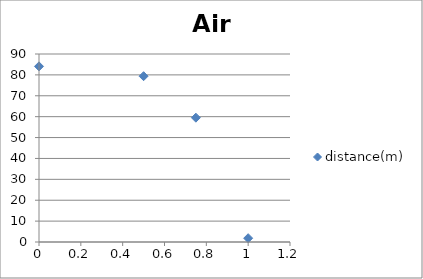
| Category | distance(m) |
|---|---|
| 0.0 | 84.086 |
| 0.5 | 79.383 |
| 0.75 | 59.512 |
| 1.0 | 1.822 |